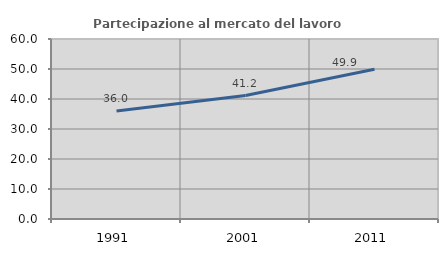
| Category | Partecipazione al mercato del lavoro  femminile |
|---|---|
| 1991.0 | 35.992 |
| 2001.0 | 41.165 |
| 2011.0 | 49.912 |